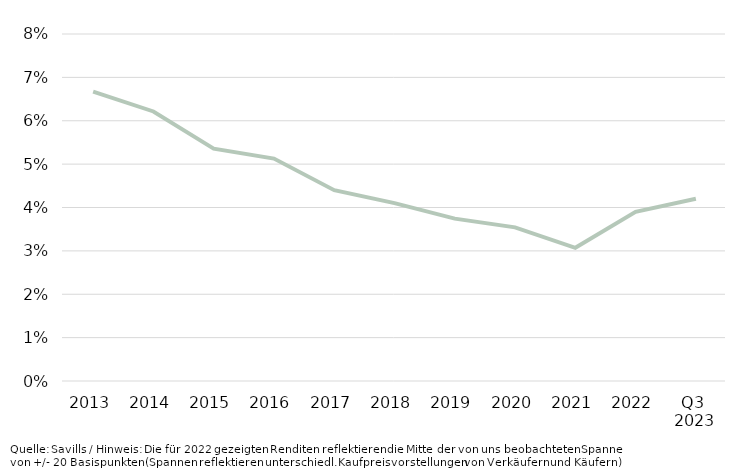
| Category | Spitzenrendite |
|---|---|
| 2013 | 0.067 |
| 2014 | 0.062 |
| 2015 | 0.054 |
| 2016 | 0.051 |
| 2017 | 0.044 |
| 2018 | 0.041 |
| 2019 | 0.037 |
| 2020 | 0.035 |
| 2021 | 0.031 |
| 2022 | 0.039 |
| Q3 
2023 | 0.042 |